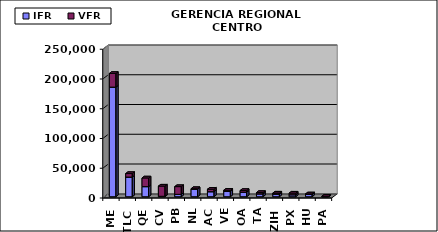
| Category | IFR | VFR |
|---|---|---|
| MEX | 184210 | 22935 |
| TLC | 33057 | 5870 |
| QET | 16991 | 14554 |
| CVA | 778 | 17070 |
| PBC | 3987 | 13016 |
| NLU | 12925 | 562 |
| ACA | 8496 | 4084 |
| VER | 8891 | 2003 |
| OAX | 7792 | 2693 |
| TAM | 4851 | 2216 |
| ZIH | 4507 | 1580 |
| PXM | 3308 | 2724 |
| HUX | 3783 | 951 |
| PAZ | 193 | 635 |